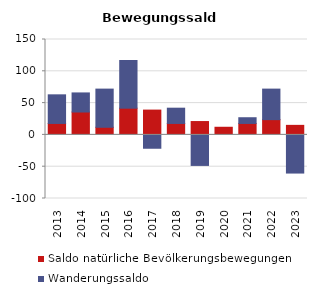
| Category | Saldo natürliche Bevölkerungsbewegungen | Wanderungssaldo |
|---|---|---|
| 2013.0 | 18 | 45 |
| 2014.0 | 36 | 30 |
| 2015.0 | 12 | 60 |
| 2016.0 | 42 | 75 |
| 2017.0 | 39 | -21 |
| 2018.0 | 18 | 24 |
| 2019.0 | 21 | -48 |
| 2020.0 | 12 | 0 |
| 2021.0 | 18 | 9 |
| 2022.0 | 24 | 48 |
| 2023.0 | 15 | -60 |